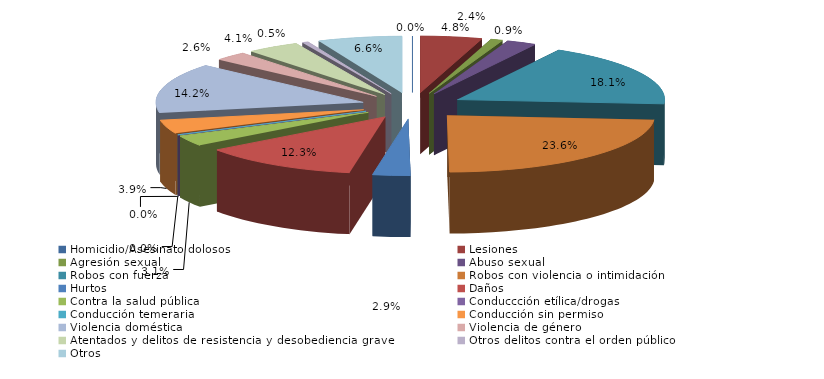
| Category | Series 0 |
|---|---|
| Homicidio/Asesinato dolosos | 0 |
| Lesiones | 41 |
| Agresión sexual | 8 |
| Abuso sexual | 20 |
| Robos con fuerza | 154 |
| Robos con violencia o intimidación | 201 |
| Hurtos | 25 |
| Daños | 105 |
| Contra la salud pública | 26 |
| Conduccción etílica/drogas | 0 |
| Conducción temeraria | 0 |
| Conducción sin permiso | 33 |
| Violencia doméstica | 121 |
| Violencia de género | 22 |
| Atentados y delitos de resistencia y desobediencia grave | 35 |
| Otros delitos contra el orden público | 4 |
| Otros | 56 |